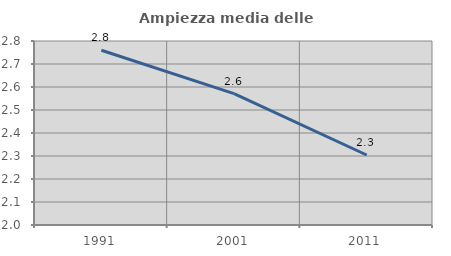
| Category | Ampiezza media delle famiglie |
|---|---|
| 1991.0 | 2.76 |
| 2001.0 | 2.571 |
| 2011.0 | 2.304 |